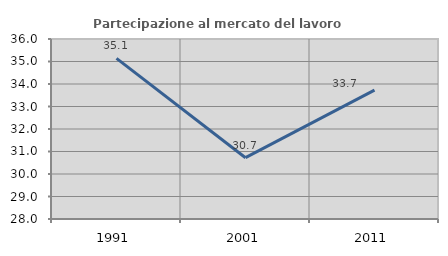
| Category | Partecipazione al mercato del lavoro  femminile |
|---|---|
| 1991.0 | 35.137 |
| 2001.0 | 30.725 |
| 2011.0 | 33.726 |